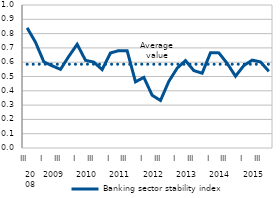
| Category | Banking sector stability index | Average value |
|---|---|---|
| 0 | 0.84 | 0.586 |
| 1 | 0.74 | 0.586 |
| 2 | 0.602 | 0.586 |
| 3 | 0.575 | 0.586 |
| 4 | 0.55 | 0.586 |
| 5 | 0.641 | 0.586 |
| 6 | 0.725 | 0.586 |
| 7 | 0.613 | 0.586 |
| 8 | 0.601 | 0.586 |
| 9 | 0.548 | 0.586 |
| 10 | 0.665 | 0.586 |
| 11 | 0.681 | 0.586 |
| 12 | 0.68 | 0.586 |
| 13 | 0.463 | 0.586 |
| 14 | 0.494 | 0.586 |
| 15 | 0.369 | 0.586 |
| 16 | 0.332 | 0.586 |
| 17 | 0.466 | 0.586 |
| 18 | 0.558 | 0.586 |
| 19 | 0.611 | 0.586 |
| 20 | 0.541 | 0.586 |
| 21 | 0.523 | 0.586 |
| 22 | 0.666 | 0.586 |
| 23 | 0.665 | 0.586 |
| 24 | 0.592 | 0.586 |
| 25 | 0.502 | 0.586 |
| 26 | 0.576 | 0.586 |
| 27 | 0.615 | 0.586 |
| 28 | 0.602 | 0.586 |
| 29 | 0.536 | 0.586 |